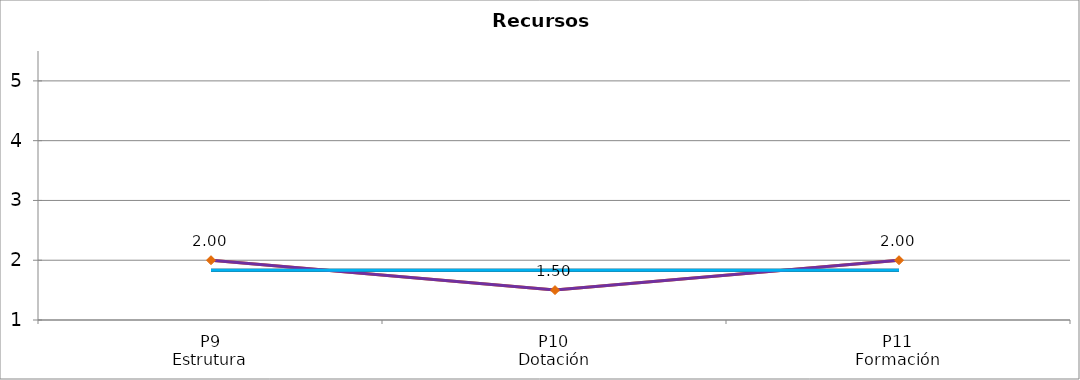
| Category | Valoración (1-5) | MEDIA |
|---|---|---|
| P9
Estrutura | 2 | 1.833 |
| P10
Dotación | 1.5 | 1.833 |
| P11
Formación | 2 | 1.833 |